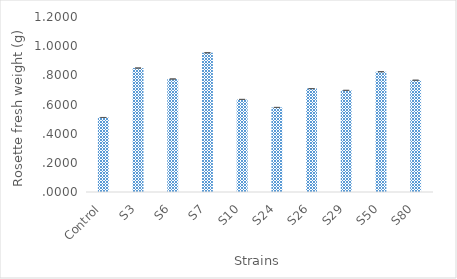
| Category | rosette fresh weight |
|---|---|
| Control | 0.511 |
| S3 | 0.85 |
| S6 | 0.775 |
| S7 | 0.955 |
| S10 | 0.635 |
| S24 | 0.58 |
| S26 | 0.709 |
| S29 | 0.697 |
| S50 | 0.825 |
| S80 | 0.766 |